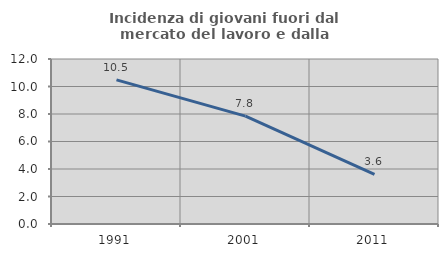
| Category | Incidenza di giovani fuori dal mercato del lavoro e dalla formazione  |
|---|---|
| 1991.0 | 10.484 |
| 2001.0 | 7.843 |
| 2011.0 | 3.614 |